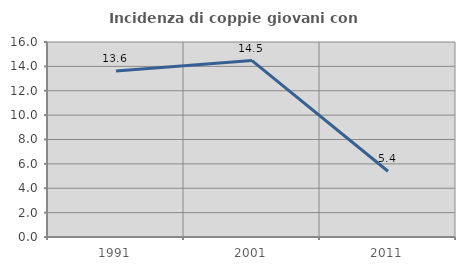
| Category | Incidenza di coppie giovani con figli |
|---|---|
| 1991.0 | 13.619 |
| 2001.0 | 14.474 |
| 2011.0 | 5.392 |